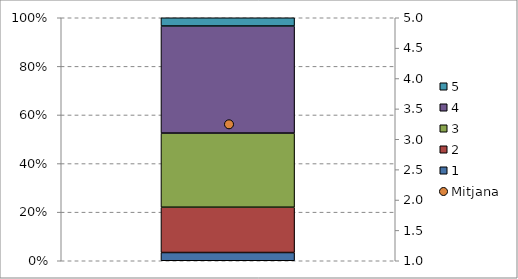
| Category | 1 | 2 | 3 | 4 | 5 |
|---|---|---|---|---|---|
| 0 | 0.034 | 0.186 | 0.305 | 0.441 | 0.034 |